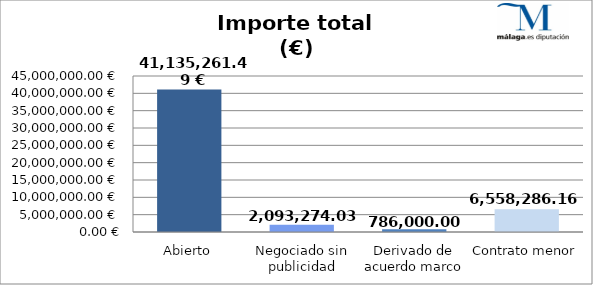
| Category | Importe total |
|---|---|
| Abierto | 41135261.49 |
| Negociado sin publicidad | 2093274.03 |
| Derivado de acuerdo marco | 786000 |
| Contrato menor | 6558286.16 |